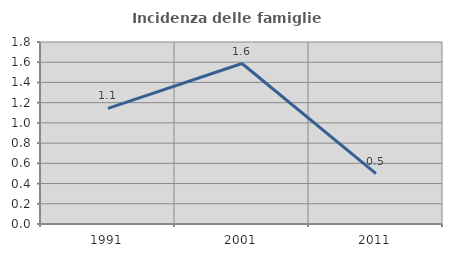
| Category | Incidenza delle famiglie numerose |
|---|---|
| 1991.0 | 1.143 |
| 2001.0 | 1.587 |
| 2011.0 | 0.499 |